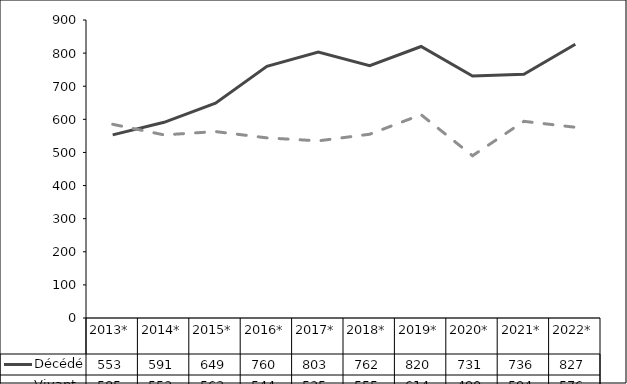
| Category | Décédé | Vivant |
|---|---|---|
| 2013* | 553 | 585 |
| 2014* | 591 | 553 |
| 2015* | 649 | 563 |
| 2016* | 760 | 544 |
| 2017* | 803 | 535 |
| 2018* | 762 | 555 |
| 2019* | 820 | 614 |
| 2020* | 731 | 490 |
| 2021* | 736 | 594 |
| 2022* | 827 | 576 |